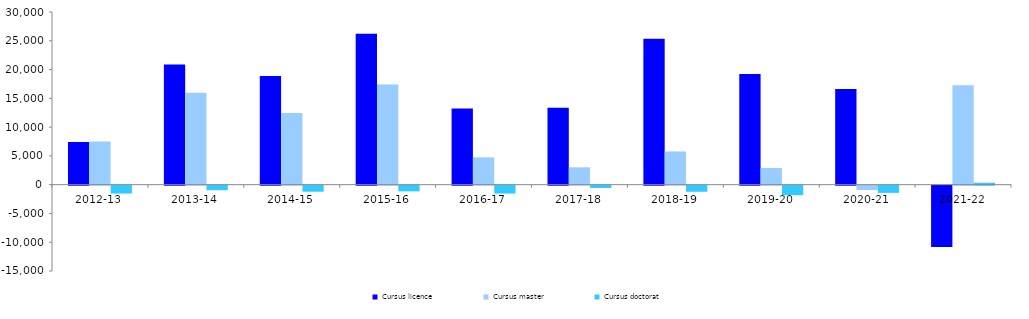
| Category | Cursus licence | Cursus master | Cursus doctorat |
|---|---|---|---|
| 2012-13 | 7424 | 7497 | -1375 |
| 2013-14 | 20890 | 15955 | -792 |
| 2014-15 | 18871 | 12457 | -1046 |
| 2015-16 | 26212 | 17406 | -992 |
| 2016-17 | 13229 | 4752 | -1372 |
| 2017-18 | 13355 | 3014 | -402 |
| 2018-19 | 25351 | 5770 | -1059 |
| 2019-20 | 19211 | 2908 | -1652 |
| 2020-21 | 16629 | -747 | -1254 |
| 2021-22 | -10666 | 17262 | 340 |